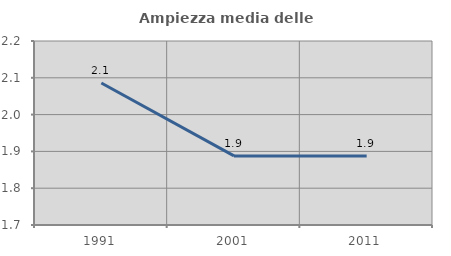
| Category | Ampiezza media delle famiglie |
|---|---|
| 1991.0 | 2.086 |
| 2001.0 | 1.888 |
| 2011.0 | 1.888 |